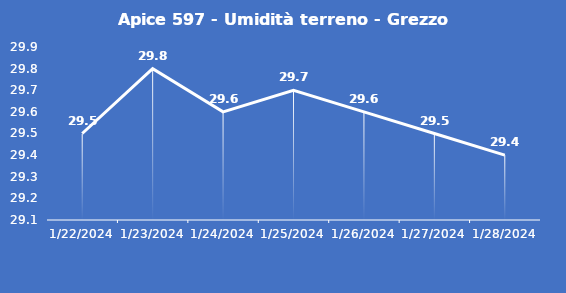
| Category | Apice 597 - Umidità terreno - Grezzo (%VWC) |
|---|---|
| 1/22/24 | 29.5 |
| 1/23/24 | 29.8 |
| 1/24/24 | 29.6 |
| 1/25/24 | 29.7 |
| 1/26/24 | 29.6 |
| 1/27/24 | 29.5 |
| 1/28/24 | 29.4 |